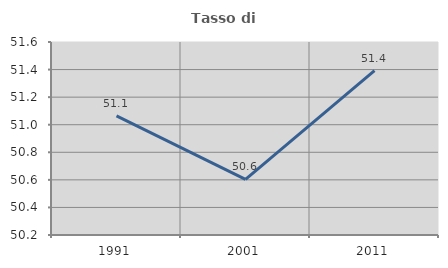
| Category | Tasso di occupazione   |
|---|---|
| 1991.0 | 51.064 |
| 2001.0 | 50.604 |
| 2011.0 | 51.393 |